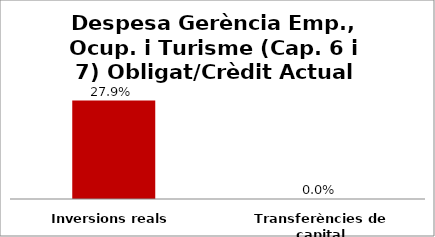
| Category | Series 0 |
|---|---|
| Inversions reals | 0.279 |
| Transferències de capital | 0 |